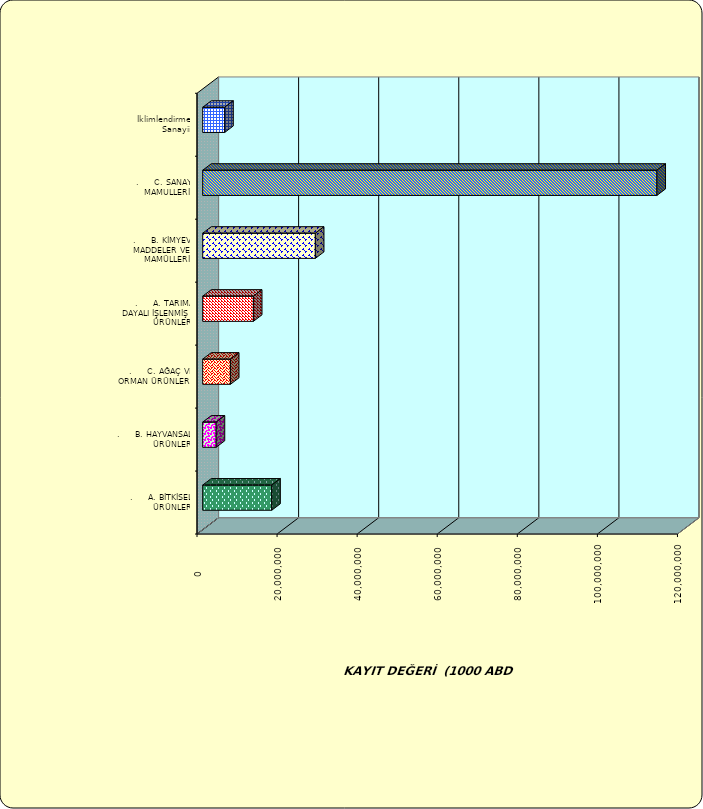
| Category | Series 0 |
|---|---|
| .     A. BİTKİSEL ÜRÜNLER | 17243340.121 |
| .     B. HAYVANSAL ÜRÜNLER | 3359333.362 |
| .     C. AĞAÇ VE ORMAN ÜRÜNLERİ | 6922891.968 |
| .     A. TARIMA DAYALI İŞLENMİŞ ÜRÜNLER | 12661069.947 |
| .     B. KİMYEVİ MADDELER VE MAMÜLLERİ | 28139271.993 |
| .     C. SANAYİ MAMULLERİ | 113443003.457 |
|  İklimlendirme Sanayii | 5496582.221 |